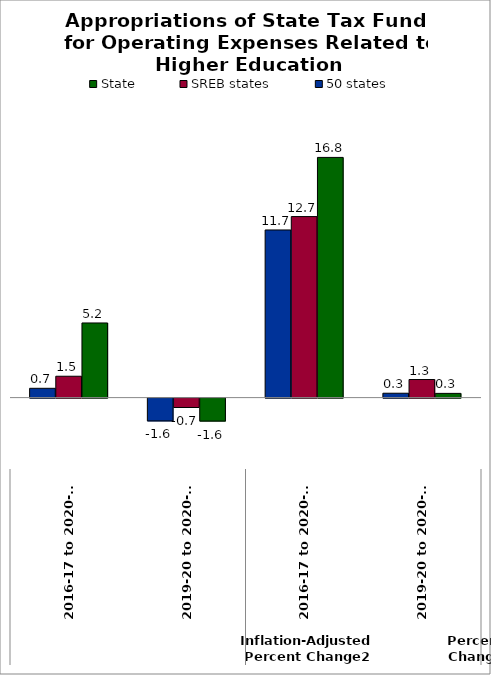
| Category | State | SREB states | 50 states |
|---|---|---|---|
| 0 | 0.296 | 1.266 | 0.307 |
| 1 | 16.819 | 12.677 | 11.739 |
| 2 | -1.609 | -0.658 | -1.599 |
| 3 | 5.227 | 1.496 | 0.651 |